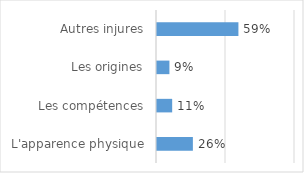
| Category | Series 0 |
|---|---|
| L'apparence physique | 0.26 |
| Les compétences | 0.11 |
| Les origines | 0.09 |
| Autres injures | 0.59 |